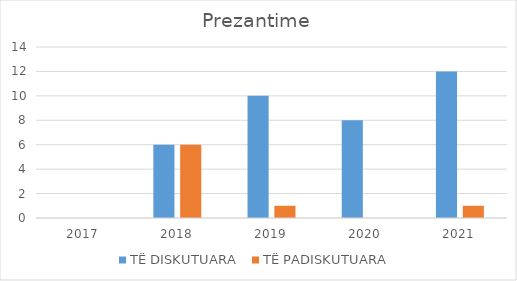
| Category | TË DISKUTUARA  | TË PADISKUTUARA  |
|---|---|---|
| 2017.0 | 0 | 0 |
| 2018.0 | 6 | 6 |
| 2019.0 | 10 | 1 |
| 2020.0 | 8 | 0 |
| 2021.0 | 12 | 1 |